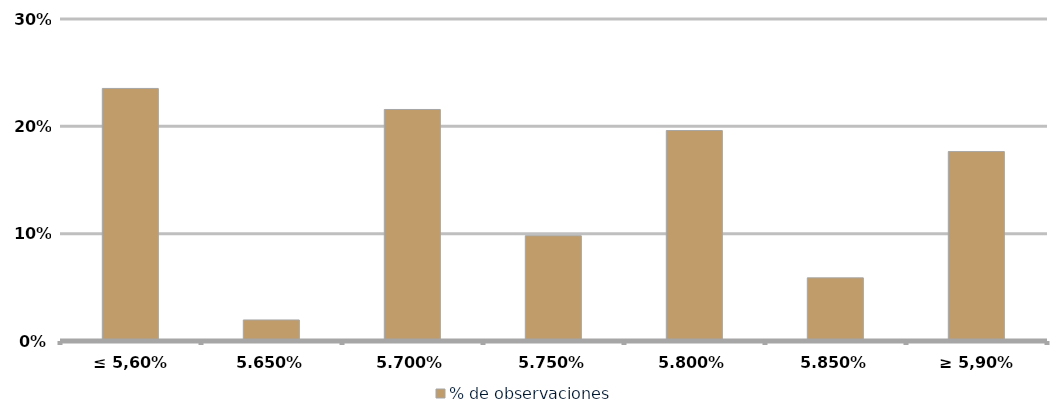
| Category | % de observaciones  |
|---|---|
| ≤ 5,60% | 0.235 |
| 5,65% | 0.02 |
| 5,70% | 0.216 |
| 5,75% | 0.098 |
| 5,80% | 0.196 |
| 5,85% | 0.059 |
| ≥ 5,90% | 0.176 |